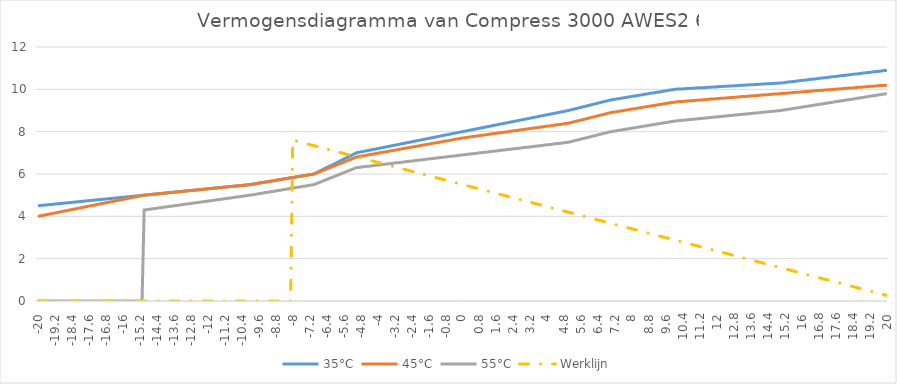
| Category | 35°C | 45°C | 55°C | Werklijn |
|---|---|---|---|---|
| -20.0 | 4.5 | 4 | 0 | 0 |
| -19.9 | 4.51 | 4.02 | 0 | 0 |
| -19.8 | 4.52 | 4.04 | 0 | 0 |
| -19.7 | 4.53 | 4.06 | 0 | 0 |
| -19.6 | 4.54 | 4.08 | 0 | 0 |
| -19.5 | 4.55 | 4.1 | 0 | 0 |
| -19.4 | 4.56 | 4.12 | 0 | 0 |
| -19.3 | 4.57 | 4.14 | 0 | 0 |
| -19.2 | 4.58 | 4.16 | 0 | 0 |
| -19.1 | 4.59 | 4.18 | 0 | 0 |
| -19.0 | 4.6 | 4.2 | 0 | 0 |
| -18.9 | 4.61 | 4.22 | 0 | 0 |
| -18.8 | 4.62 | 4.24 | 0 | 0 |
| -18.7 | 4.63 | 4.26 | 0 | 0 |
| -18.6 | 4.64 | 4.28 | 0 | 0 |
| -18.5 | 4.65 | 4.3 | 0 | 0 |
| -18.4 | 4.66 | 4.32 | 0 | 0 |
| -18.3 | 4.67 | 4.34 | 0 | 0 |
| -18.2 | 4.68 | 4.36 | 0 | 0 |
| -18.1 | 4.69 | 4.38 | 0 | 0 |
| -18.0 | 4.7 | 4.4 | 0 | 0 |
| -17.9 | 4.71 | 4.42 | 0 | 0 |
| -17.8 | 4.72 | 4.44 | 0 | 0 |
| -17.7 | 4.73 | 4.46 | 0 | 0 |
| -17.6 | 4.74 | 4.48 | 0 | 0 |
| -17.5 | 4.75 | 4.5 | 0 | 0 |
| -17.4 | 4.76 | 4.52 | 0 | 0 |
| -17.3 | 4.77 | 4.54 | 0 | 0 |
| -17.2 | 4.78 | 4.56 | 0 | 0 |
| -17.1 | 4.79 | 4.58 | 0 | 0 |
| -17.0 | 4.8 | 4.6 | 0 | 0 |
| -16.9 | 4.81 | 4.62 | 0 | 0 |
| -16.8 | 4.82 | 4.64 | 0 | 0 |
| -16.7 | 4.83 | 4.66 | 0 | 0 |
| -16.6 | 4.84 | 4.68 | 0 | 0 |
| -16.5 | 4.85 | 4.7 | 0 | 0 |
| -16.4 | 4.86 | 4.72 | 0 | 0 |
| -16.3 | 4.87 | 4.74 | 0 | 0 |
| -16.2 | 4.88 | 4.76 | 0 | 0 |
| -16.1 | 4.89 | 4.78 | 0 | 0 |
| -16.0 | 4.9 | 4.8 | 0 | 0 |
| -15.9 | 4.91 | 4.82 | 0 | 0 |
| -15.8 | 4.92 | 4.84 | 0 | 0 |
| -15.7 | 4.93 | 4.86 | 0 | 0 |
| -15.6 | 4.94 | 4.88 | 0 | 0 |
| -15.5 | 4.95 | 4.9 | 0 | 0 |
| -15.4 | 4.96 | 4.92 | 0 | 0 |
| -15.3 | 4.97 | 4.94 | 0 | 0 |
| -15.2 | 4.98 | 4.96 | 0 | 0 |
| -15.1 | 4.99 | 4.98 | 0 | 0 |
| -15.0 | 5 | 5 | 4.3 | 0 |
| -14.9 | 5.01 | 5.01 | 4.31 | 0 |
| -14.8 | 5.02 | 5.02 | 4.33 | 0 |
| -14.7 | 5.03 | 5.03 | 4.34 | 0 |
| -14.6 | 5.04 | 5.04 | 4.36 | 0 |
| -14.5 | 5.05 | 5.05 | 4.37 | 0 |
| -14.4 | 5.06 | 5.06 | 4.38 | 0 |
| -14.3 | 5.07 | 5.07 | 4.4 | 0 |
| -14.2 | 5.08 | 5.08 | 4.41 | 0 |
| -14.1 | 5.09 | 5.09 | 4.43 | 0 |
| -14.0 | 5.1 | 5.1 | 4.44 | 0 |
| -13.9 | 5.11 | 5.11 | 4.45 | 0 |
| -13.8 | 5.12 | 5.12 | 4.47 | 0 |
| -13.7 | 5.13 | 5.13 | 4.48 | 0 |
| -13.6 | 5.14 | 5.14 | 4.5 | 0 |
| -13.5 | 5.15 | 5.15 | 4.51 | 0 |
| -13.4 | 5.16 | 5.16 | 4.52 | 0 |
| -13.3 | 5.17 | 5.17 | 4.54 | 0 |
| -13.2 | 5.18 | 5.18 | 4.55 | 0 |
| -13.1 | 5.19 | 5.19 | 4.57 | 0 |
| -13.0 | 5.2 | 5.2 | 4.58 | 0 |
| -12.9 | 5.21 | 5.21 | 4.59 | 0 |
| -12.8 | 5.22 | 5.22 | 4.61 | 0 |
| -12.7 | 5.23 | 5.23 | 4.62 | 0 |
| -12.6 | 5.24 | 5.24 | 4.64 | 0 |
| -12.5 | 5.25 | 5.25 | 4.65 | 0 |
| -12.4 | 5.26 | 5.26 | 4.66 | 0 |
| -12.3 | 5.27 | 5.27 | 4.68 | 0 |
| -12.2 | 5.28 | 5.28 | 4.69 | 0 |
| -12.1 | 5.29 | 5.29 | 4.71 | 0 |
| -12.0 | 5.3 | 5.3 | 4.72 | 0 |
| -11.9 | 5.31 | 5.31 | 4.73 | 0 |
| -11.8 | 5.32 | 5.32 | 4.75 | 0 |
| -11.7 | 5.33 | 5.33 | 4.76 | 0 |
| -11.6 | 5.34 | 5.34 | 4.78 | 0 |
| -11.5 | 5.35 | 5.35 | 4.79 | 0 |
| -11.4 | 5.36 | 5.36 | 4.8 | 0 |
| -11.3 | 5.37 | 5.37 | 4.82 | 0 |
| -11.2 | 5.38 | 5.38 | 4.83 | 0 |
| -11.1 | 5.39 | 5.39 | 4.85 | 0 |
| -11.0 | 5.4 | 5.4 | 4.86 | 0 |
| -10.9 | 5.41 | 5.41 | 4.87 | 0 |
| -10.8 | 5.42 | 5.42 | 4.89 | 0 |
| -10.7 | 5.43 | 5.43 | 4.9 | 0 |
| -10.6 | 5.44 | 5.44 | 4.92 | 0 |
| -10.5 | 5.45 | 5.45 | 4.93 | 0 |
| -10.4 | 5.46 | 5.46 | 4.94 | 0 |
| -10.3 | 5.47 | 5.47 | 4.96 | 0 |
| -10.2 | 5.48 | 5.48 | 4.97 | 0 |
| -10.1 | 5.49 | 5.49 | 4.99 | 0 |
| -10.0 | 5.5 | 5.5 | 5 | 0 |
| -9.9 | 5.52 | 5.52 | 5.02 | 0 |
| -9.8 | 5.53 | 5.53 | 5.03 | 0 |
| -9.7 | 5.55 | 5.55 | 5.05 | 0 |
| -9.6 | 5.57 | 5.57 | 5.07 | 0 |
| -9.5 | 5.58 | 5.58 | 5.08 | 0 |
| -9.4 | 5.6 | 5.6 | 5.1 | 0 |
| -9.3 | 5.62 | 5.62 | 5.12 | 0 |
| -9.2 | 5.63 | 5.63 | 5.13 | 0 |
| -9.1 | 5.65 | 5.65 | 5.15 | 0 |
| -9.0 | 5.67 | 5.67 | 5.17 | 0 |
| -8.9 | 5.68 | 5.68 | 5.18 | 0 |
| -8.8 | 5.7 | 5.7 | 5.2 | 0 |
| -8.7 | 5.72 | 5.72 | 5.22 | 0 |
| -8.6 | 5.73 | 5.73 | 5.23 | 0 |
| -8.5 | 5.75 | 5.75 | 5.25 | 0 |
| -8.4 | 5.77 | 5.77 | 5.27 | 0 |
| -8.3 | 5.78 | 5.78 | 5.28 | 0 |
| -8.2 | 5.8 | 5.8 | 5.3 | 0 |
| -8.1 | 5.82 | 5.82 | 5.32 | 0 |
| -8.0 | 5.83 | 5.83 | 5.33 | 7.6 |
| -7.9 | 5.85 | 5.85 | 5.35 | 7.574 |
| -7.8 | 5.87 | 5.87 | 5.37 | 7.548 |
| -7.7 | 5.88 | 5.88 | 5.38 | 7.521 |
| -7.6 | 5.9 | 5.9 | 5.4 | 7.495 |
| -7.5 | 5.92 | 5.92 | 5.42 | 7.469 |
| -7.4 | 5.93 | 5.93 | 5.43 | 7.443 |
| -7.3 | 5.95 | 5.95 | 5.45 | 7.417 |
| -7.2 | 5.97 | 5.97 | 5.47 | 7.39 |
| -7.1 | 5.98 | 5.98 | 5.48 | 7.364 |
| -7.0 | 6 | 6 | 5.5 | 7.338 |
| -6.9 | 6.05 | 6.04 | 5.54 | 7.312 |
| -6.8 | 6.1 | 6.08 | 5.58 | 7.286 |
| -6.7 | 6.15 | 6.12 | 5.62 | 7.259 |
| -6.6 | 6.2 | 6.16 | 5.66 | 7.233 |
| -6.5 | 6.25 | 6.2 | 5.7 | 7.207 |
| -6.4 | 6.3 | 6.24 | 5.74 | 7.181 |
| -6.3 | 6.35 | 6.28 | 5.78 | 7.154 |
| -6.2 | 6.4 | 6.32 | 5.82 | 7.128 |
| -6.1 | 6.45 | 6.36 | 5.86 | 7.102 |
| -6.0 | 6.5 | 6.4 | 5.9 | 7.076 |
| -5.9 | 6.55 | 6.44 | 5.94 | 7.05 |
| -5.8 | 6.6 | 6.48 | 5.98 | 7.023 |
| -5.7 | 6.65 | 6.52 | 6.02 | 6.997 |
| -5.6 | 6.7 | 6.56 | 6.06 | 6.971 |
| -5.5 | 6.75 | 6.6 | 6.1 | 6.945 |
| -5.4 | 6.8 | 6.64 | 6.14 | 6.919 |
| -5.3 | 6.85 | 6.68 | 6.18 | 6.892 |
| -5.2 | 6.9 | 6.72 | 6.22 | 6.866 |
| -5.1 | 6.95 | 6.76 | 6.26 | 6.84 |
| -5.0 | 7 | 6.8 | 6.3 | 6.814 |
| -4.9 | 7.02 | 6.82 | 6.31 | 6.788 |
| -4.8 | 7.04 | 6.84 | 6.32 | 6.761 |
| -4.7 | 7.06 | 6.85 | 6.34 | 6.735 |
| -4.6 | 7.08 | 6.87 | 6.35 | 6.709 |
| -4.5 | 7.1 | 6.89 | 6.36 | 6.683 |
| -4.4 | 7.12 | 6.91 | 6.37 | 6.657 |
| -4.3 | 7.14 | 6.93 | 6.38 | 6.63 |
| -4.2 | 7.16 | 6.94 | 6.4 | 6.604 |
| -4.1 | 7.18 | 6.96 | 6.41 | 6.578 |
| -4.0 | 7.2 | 6.98 | 6.42 | 6.552 |
| -3.9 | 7.22 | 7 | 6.43 | 6.526 |
| -3.8 | 7.24 | 7.02 | 6.44 | 6.499 |
| -3.7 | 7.26 | 7.03 | 6.46 | 6.473 |
| -3.6 | 7.28 | 7.05 | 6.47 | 6.447 |
| -3.5 | 7.3 | 7.07 | 6.48 | 6.421 |
| -3.4 | 7.32 | 7.09 | 6.49 | 6.394 |
| -3.3 | 7.34 | 7.11 | 6.5 | 6.368 |
| -3.2 | 7.36 | 7.12 | 6.52 | 6.342 |
| -3.1 | 7.38 | 7.14 | 6.53 | 6.316 |
| -3.0 | 7.4 | 7.16 | 6.54 | 6.29 |
| -2.9 | 7.42 | 7.18 | 6.55 | 6.263 |
| -2.8 | 7.44 | 7.2 | 6.56 | 6.237 |
| -2.7 | 7.46 | 7.21 | 6.58 | 6.211 |
| -2.6 | 7.48 | 7.23 | 6.59 | 6.185 |
| -2.5 | 7.5 | 7.25 | 6.6 | 6.159 |
| -2.4 | 7.52 | 7.27 | 6.61 | 6.132 |
| -2.3 | 7.54 | 7.29 | 6.62 | 6.106 |
| -2.2 | 7.56 | 7.3 | 6.64 | 6.08 |
| -2.1 | 7.58 | 7.32 | 6.65 | 6.054 |
| -2.0 | 7.6 | 7.34 | 6.66 | 6.028 |
| -1.9 | 7.62 | 7.36 | 6.67 | 6.001 |
| -1.8 | 7.64 | 7.38 | 6.68 | 5.975 |
| -1.7 | 7.66 | 7.39 | 6.7 | 5.949 |
| -1.6 | 7.68 | 7.41 | 6.71 | 5.923 |
| -1.5 | 7.7 | 7.43 | 6.72 | 5.897 |
| -1.4 | 7.72 | 7.45 | 6.73 | 5.87 |
| -1.3 | 7.74 | 7.47 | 6.74 | 5.844 |
| -1.2 | 7.76 | 7.48 | 6.76 | 5.818 |
| -1.1 | 7.78 | 7.5 | 6.77 | 5.792 |
| -1.0 | 7.8 | 7.52 | 6.78 | 5.766 |
| -0.9 | 7.82 | 7.54 | 6.79 | 5.739 |
| -0.8 | 7.84 | 7.56 | 6.8 | 5.713 |
| -0.7 | 7.86 | 7.57 | 6.82 | 5.687 |
| -0.6 | 7.88 | 7.59 | 6.83 | 5.661 |
| -0.5 | 7.9 | 7.61 | 6.84 | 5.634 |
| -0.4 | 7.92 | 7.63 | 6.85 | 5.608 |
| -0.3 | 7.94 | 7.65 | 6.86 | 5.582 |
| -0.2 | 7.96 | 7.66 | 6.88 | 5.556 |
| -0.1 | 7.98 | 7.68 | 6.89 | 5.53 |
| 0.0 | 8 | 7.7 | 6.9 | 5.503 |
| 0.1 | 8.02 | 7.71 | 6.91 | 5.477 |
| 0.2 | 8.04 | 7.73 | 6.92 | 5.451 |
| 0.3 | 8.06 | 7.74 | 6.94 | 5.425 |
| 0.4 | 8.08 | 7.76 | 6.95 | 5.399 |
| 0.5 | 8.1 | 7.77 | 6.96 | 5.372 |
| 0.6 | 8.12 | 7.78 | 6.97 | 5.346 |
| 0.7 | 8.14 | 7.8 | 6.98 | 5.32 |
| 0.8 | 8.16 | 7.81 | 7 | 5.294 |
| 0.9 | 8.18 | 7.83 | 7.01 | 5.268 |
| 1.0 | 8.2 | 7.84 | 7.02 | 5.241 |
| 1.1 | 8.22 | 7.85 | 7.03 | 5.215 |
| 1.2 | 8.24 | 7.87 | 7.04 | 5.189 |
| 1.3 | 8.26 | 7.88 | 7.06 | 5.163 |
| 1.4 | 8.28 | 7.9 | 7.07 | 5.137 |
| 1.5 | 8.3 | 7.91 | 7.08 | 5.11 |
| 1.6 | 8.32 | 7.92 | 7.09 | 5.084 |
| 1.7 | 8.34 | 7.94 | 7.1 | 5.058 |
| 1.8 | 8.36 | 7.95 | 7.12 | 5.032 |
| 1.9 | 8.38 | 7.97 | 7.13 | 5.006 |
| 2.0 | 8.4 | 7.98 | 7.14 | 4.979 |
| 2.1 | 8.42 | 7.99 | 7.15 | 4.953 |
| 2.2 | 8.44 | 8.01 | 7.16 | 4.927 |
| 2.3 | 8.46 | 8.02 | 7.18 | 4.901 |
| 2.4 | 8.48 | 8.04 | 7.19 | 4.874 |
| 2.5 | 8.5 | 8.05 | 7.2 | 4.848 |
| 2.6 | 8.52 | 8.06 | 7.21 | 4.822 |
| 2.7 | 8.54 | 8.08 | 7.22 | 4.796 |
| 2.8 | 8.56 | 8.09 | 7.24 | 4.77 |
| 2.9 | 8.58 | 8.11 | 7.25 | 4.743 |
| 3.0 | 8.6 | 8.12 | 7.26 | 4.717 |
| 3.1 | 8.62 | 8.13 | 7.27 | 4.691 |
| 3.2 | 8.64 | 8.15 | 7.28 | 4.665 |
| 3.3 | 8.66 | 8.16 | 7.3 | 4.639 |
| 3.4 | 8.68 | 8.18 | 7.31 | 4.612 |
| 3.5 | 8.7 | 8.19 | 7.32 | 4.586 |
| 3.6 | 8.72 | 8.2 | 7.33 | 4.56 |
| 3.7 | 8.74 | 8.22 | 7.34 | 4.534 |
| 3.8 | 8.76 | 8.23 | 7.36 | 4.508 |
| 3.9 | 8.78 | 8.25 | 7.37 | 4.481 |
| 4.0 | 8.8 | 8.26 | 7.38 | 4.455 |
| 4.1 | 8.82 | 8.27 | 7.39 | 4.429 |
| 4.2 | 8.84 | 8.29 | 7.4 | 4.403 |
| 4.3 | 8.86 | 8.3 | 7.42 | 4.377 |
| 4.4 | 8.88 | 8.32 | 7.43 | 4.35 |
| 4.5 | 8.9 | 8.33 | 7.44 | 4.324 |
| 4.6 | 8.92 | 8.34 | 7.45 | 4.298 |
| 4.7 | 8.94 | 8.36 | 7.46 | 4.272 |
| 4.8 | 8.96 | 8.37 | 7.48 | 4.246 |
| 4.9 | 8.98 | 8.39 | 7.49 | 4.219 |
| 5.0 | 9 | 8.4 | 7.5 | 4.193 |
| 5.1 | 9.03 | 8.43 | 7.53 | 4.167 |
| 5.2 | 9.05 | 8.45 | 7.55 | 4.141 |
| 5.3 | 9.08 | 8.48 | 7.58 | 4.114 |
| 5.4 | 9.1 | 8.5 | 7.6 | 4.088 |
| 5.5 | 9.13 | 8.53 | 7.63 | 4.062 |
| 5.6 | 9.15 | 8.55 | 7.65 | 4.036 |
| 5.7 | 9.18 | 8.58 | 7.68 | 4.01 |
| 5.8 | 9.2 | 8.6 | 7.7 | 3.983 |
| 5.9 | 9.23 | 8.63 | 7.73 | 3.957 |
| 6.0 | 9.25 | 8.65 | 7.75 | 3.931 |
| 6.1 | 9.28 | 8.68 | 7.78 | 3.905 |
| 6.2 | 9.3 | 8.7 | 7.8 | 3.879 |
| 6.3 | 9.33 | 8.73 | 7.83 | 3.852 |
| 6.4 | 9.35 | 8.75 | 7.85 | 3.826 |
| 6.5 | 9.38 | 8.78 | 7.88 | 3.8 |
| 6.6 | 9.4 | 8.8 | 7.9 | 3.774 |
| 6.7 | 9.43 | 8.83 | 7.93 | 3.748 |
| 6.8 | 9.45 | 8.85 | 7.95 | 3.721 |
| 6.9 | 9.48 | 8.88 | 7.98 | 3.695 |
| 7.0 | 9.5 | 8.9 | 8 | 3.669 |
| 7.1 | 9.52 | 8.92 | 8.02 | 3.643 |
| 7.2 | 9.53 | 8.93 | 8.03 | 3.617 |
| 7.3 | 9.55 | 8.95 | 8.05 | 3.59 |
| 7.4 | 9.57 | 8.97 | 8.07 | 3.564 |
| 7.5 | 9.58 | 8.98 | 8.08 | 3.538 |
| 7.6 | 9.6 | 9 | 8.1 | 3.512 |
| 7.7 | 9.62 | 9.02 | 8.12 | 3.486 |
| 7.8 | 9.63 | 9.03 | 8.13 | 3.459 |
| 7.9 | 9.65 | 9.05 | 8.15 | 3.433 |
| 8.0 | 9.67 | 9.07 | 8.17 | 3.407 |
| 8.1 | 9.68 | 9.08 | 8.18 | 3.381 |
| 8.2 | 9.7 | 9.1 | 8.2 | 3.354 |
| 8.3 | 9.72 | 9.12 | 8.22 | 3.328 |
| 8.4 | 9.73 | 9.13 | 8.23 | 3.302 |
| 8.5 | 9.75 | 9.15 | 8.25 | 3.276 |
| 8.6 | 9.77 | 9.17 | 8.27 | 3.25 |
| 8.7 | 9.78 | 9.18 | 8.28 | 3.223 |
| 8.8 | 9.8 | 9.2 | 8.3 | 3.197 |
| 8.9 | 9.82 | 9.22 | 8.32 | 3.171 |
| 9.0 | 9.83 | 9.23 | 8.33 | 3.145 |
| 9.1 | 9.85 | 9.25 | 8.35 | 3.119 |
| 9.2 | 9.87 | 9.27 | 8.37 | 3.092 |
| 9.3 | 9.88 | 9.28 | 8.38 | 3.066 |
| 9.4 | 9.9 | 9.3 | 8.4 | 3.04 |
| 9.5 | 9.92 | 9.32 | 8.42 | 3.014 |
| 9.6 | 9.93 | 9.33 | 8.43 | 2.988 |
| 9.7 | 9.95 | 9.35 | 8.45 | 2.961 |
| 9.8 | 9.97 | 9.37 | 8.47 | 2.935 |
| 9.9 | 9.98 | 9.38 | 8.48 | 2.909 |
| 10.0 | 10 | 9.4 | 8.5 | 2.883 |
| 10.1 | 10.01 | 9.41 | 8.51 | 2.857 |
| 10.2 | 10.01 | 9.42 | 8.52 | 2.83 |
| 10.3 | 10.02 | 9.42 | 8.53 | 2.804 |
| 10.4 | 10.02 | 9.43 | 8.54 | 2.778 |
| 10.5 | 10.03 | 9.44 | 8.55 | 2.752 |
| 10.6 | 10.04 | 9.45 | 8.56 | 2.726 |
| 10.7 | 10.04 | 9.46 | 8.57 | 2.699 |
| 10.8 | 10.05 | 9.46 | 8.58 | 2.673 |
| 10.9 | 10.05 | 9.47 | 8.59 | 2.647 |
| 11.0 | 10.06 | 9.48 | 8.6 | 2.621 |
| 11.1 | 10.07 | 9.49 | 8.61 | 2.594 |
| 11.2 | 10.07 | 9.5 | 8.62 | 2.568 |
| 11.3 | 10.08 | 9.5 | 8.63 | 2.542 |
| 11.4 | 10.08 | 9.51 | 8.64 | 2.516 |
| 11.5 | 10.09 | 9.52 | 8.65 | 2.49 |
| 11.6 | 10.1 | 9.53 | 8.66 | 2.463 |
| 11.7 | 10.1 | 9.54 | 8.67 | 2.437 |
| 11.8 | 10.11 | 9.54 | 8.68 | 2.411 |
| 11.9 | 10.11 | 9.55 | 8.69 | 2.385 |
| 12.0 | 10.12 | 9.56 | 8.7 | 2.359 |
| 12.1 | 10.13 | 9.57 | 8.71 | 2.332 |
| 12.2 | 10.13 | 9.58 | 8.72 | 2.306 |
| 12.3 | 10.14 | 9.58 | 8.73 | 2.28 |
| 12.4 | 10.14 | 9.59 | 8.74 | 2.254 |
| 12.5 | 10.15 | 9.6 | 8.75 | 2.228 |
| 12.6 | 10.16 | 9.61 | 8.76 | 2.201 |
| 12.7 | 10.16 | 9.62 | 8.77 | 2.175 |
| 12.8 | 10.17 | 9.62 | 8.78 | 2.149 |
| 12.9 | 10.17 | 9.63 | 8.79 | 2.123 |
| 13.0 | 10.18 | 9.64 | 8.8 | 2.097 |
| 13.1 | 10.19 | 9.65 | 8.81 | 2.07 |
| 13.2 | 10.19 | 9.66 | 8.82 | 2.044 |
| 13.3 | 10.2 | 9.66 | 8.83 | 2.018 |
| 13.4 | 10.2 | 9.67 | 8.84 | 1.992 |
| 13.5 | 10.21 | 9.68 | 8.85 | 1.966 |
| 13.6 | 10.22 | 9.69 | 8.86 | 1.939 |
| 13.7 | 10.22 | 9.7 | 8.87 | 1.913 |
| 13.8 | 10.23 | 9.7 | 8.88 | 1.887 |
| 13.9 | 10.23 | 9.71 | 8.89 | 1.861 |
| 14.0 | 10.24 | 9.72 | 8.9 | 1.834 |
| 14.1 | 10.25 | 9.73 | 8.91 | 1.808 |
| 14.2 | 10.25 | 9.74 | 8.92 | 1.782 |
| 14.3 | 10.26 | 9.74 | 8.93 | 1.756 |
| 14.4 | 10.26 | 9.75 | 8.94 | 1.73 |
| 14.5 | 10.27 | 9.76 | 8.95 | 1.703 |
| 14.6 | 10.28 | 9.77 | 8.96 | 1.677 |
| 14.7 | 10.28 | 9.78 | 8.97 | 1.651 |
| 14.8 | 10.29 | 9.78 | 8.98 | 1.625 |
| 14.9 | 10.29 | 9.79 | 8.99 | 1.599 |
| 15.0 | 10.3 | 9.8 | 9 | 1.572 |
| 15.1 | 10.31 | 9.81 | 9.02 | 1.546 |
| 15.2 | 10.32 | 9.82 | 9.03 | 1.52 |
| 15.3 | 10.34 | 9.82 | 9.05 | 1.494 |
| 15.4 | 10.35 | 9.83 | 9.06 | 1.468 |
| 15.5 | 10.36 | 9.84 | 9.08 | 1.441 |
| 15.6 | 10.37 | 9.85 | 9.1 | 1.415 |
| 15.7 | 10.38 | 9.86 | 9.11 | 1.389 |
| 15.8 | 10.4 | 9.86 | 9.13 | 1.363 |
| 15.9 | 10.41 | 9.87 | 9.14 | 1.337 |
| 16.0 | 10.42 | 9.88 | 9.16 | 1.31 |
| 16.1 | 10.43 | 9.89 | 9.18 | 1.284 |
| 16.2 | 10.44 | 9.9 | 9.19 | 1.258 |
| 16.3 | 10.46 | 9.9 | 9.21 | 1.232 |
| 16.4 | 10.47 | 9.91 | 9.22 | 1.206 |
| 16.5 | 10.48 | 9.92 | 9.24 | 1.179 |
| 16.6 | 10.49 | 9.93 | 9.26 | 1.153 |
| 16.7 | 10.5 | 9.94 | 9.27 | 1.127 |
| 16.8 | 10.52 | 9.94 | 9.29 | 1.101 |
| 16.9 | 10.53 | 9.95 | 9.3 | 1.074 |
| 17.0 | 10.54 | 9.96 | 9.32 | 1.048 |
| 17.1 | 10.55 | 9.97 | 9.34 | 1.022 |
| 17.2 | 10.56 | 9.98 | 9.35 | 0.996 |
| 17.3 | 10.58 | 9.98 | 9.37 | 0.97 |
| 17.4 | 10.59 | 9.99 | 9.38 | 0.943 |
| 17.5 | 10.6 | 10 | 9.4 | 0.917 |
| 17.6 | 10.61 | 10.01 | 9.42 | 0.891 |
| 17.7 | 10.62 | 10.02 | 9.43 | 0.865 |
| 17.8 | 10.64 | 10.02 | 9.45 | 0.839 |
| 17.9 | 10.65 | 10.03 | 9.46 | 0.812 |
| 18.0 | 10.66 | 10.04 | 9.48 | 0.786 |
| 18.1 | 10.67 | 10.05 | 9.5 | 0.76 |
| 18.2 | 10.68 | 10.06 | 9.51 | 0.734 |
| 18.3 | 10.7 | 10.06 | 9.53 | 0.708 |
| 18.4 | 10.71 | 10.07 | 9.54 | 0.681 |
| 18.5 | 10.72 | 10.08 | 9.56 | 0.655 |
| 18.6 | 10.73 | 10.09 | 9.58 | 0.629 |
| 18.7 | 10.74 | 10.1 | 9.59 | 0.603 |
| 18.8 | 10.76 | 10.1 | 9.61 | 0.577 |
| 18.9 | 10.77 | 10.11 | 9.62 | 0.55 |
| 19.0 | 10.78 | 10.12 | 9.64 | 0.524 |
| 19.1 | 10.79 | 10.13 | 9.66 | 0.498 |
| 19.2 | 10.8 | 10.14 | 9.67 | 0.472 |
| 19.3 | 10.82 | 10.14 | 9.69 | 0.446 |
| 19.4 | 10.83 | 10.15 | 9.7 | 0.419 |
| 19.5 | 10.84 | 10.16 | 9.72 | 0.393 |
| 19.6 | 10.85 | 10.17 | 9.74 | 0.367 |
| 19.7 | 10.86 | 10.18 | 9.75 | 0.341 |
| 19.8 | 10.88 | 10.18 | 9.77 | 0.314 |
| 19.9 | 10.89 | 10.19 | 9.78 | 0.288 |
| 20.0 | 10.9 | 10.2 | 9.8 | 0.262 |